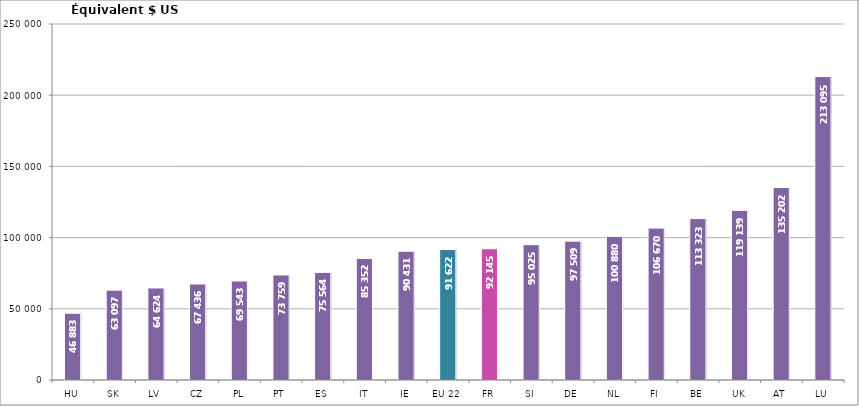
| Category | Series 0 |
|---|---|
| HU | 46883.298 |
| SK | 63096.963 |
| LV | 64624.111 |
| CZ | 67436.471 |
| PL | 69543.255 |
| PT | 73758.598 |
| ES | 75563.665 |
| IT | 85351.788 |
| IE | 90430.715 |
| EU 22 | 91622.261 |
| FR | 92144.532 |
| SI | 95025.338 |
| DE | 97508.549 |
| NL | 100879.996 |
| FI | 106670.049 |
| BE | 113323.021 |
| UK | 119139.392 |
| AT | 135202.024 |
| LU | 213095.309 |